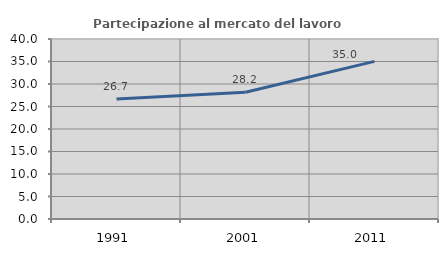
| Category | Partecipazione al mercato del lavoro  femminile |
|---|---|
| 1991.0 | 26.673 |
| 2001.0 | 28.153 |
| 2011.0 | 35.036 |